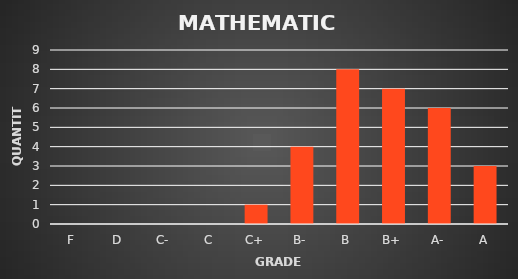
| Category | Series 0 |
|---|---|
| F | 0 |
| D | 0 |
| C- | 0 |
| C | 0 |
| C+ | 1 |
| B- | 4 |
| B | 8 |
| B+ | 7 |
| A- | 6 |
| A | 3 |